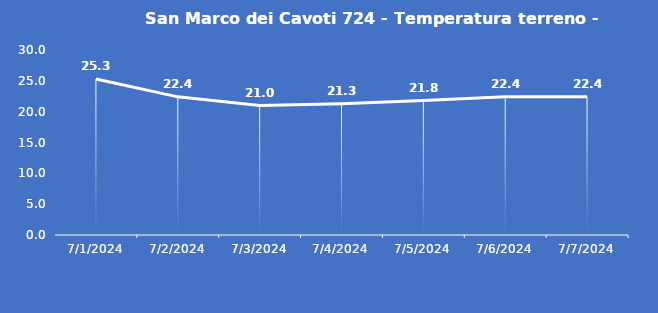
| Category | San Marco dei Cavoti 724 - Temperatura terreno - Grezzo (°C) |
|---|---|
| 7/1/24 | 25.3 |
| 7/2/24 | 22.4 |
| 7/3/24 | 21 |
| 7/4/24 | 21.3 |
| 7/5/24 | 21.8 |
| 7/6/24 | 22.4 |
| 7/7/24 | 22.4 |